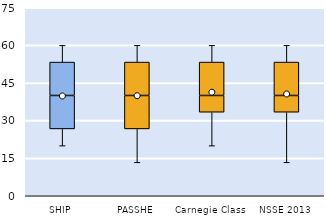
| Category | 25th | 50th | 75th |
|---|---|---|---|
| SHIP | 26.667 | 13.333 | 13.333 |
| PASSHE | 26.667 | 13.333 | 13.333 |
| Carnegie Class | 33.333 | 6.667 | 13.333 |
| NSSE 2013 | 33.333 | 6.667 | 13.333 |